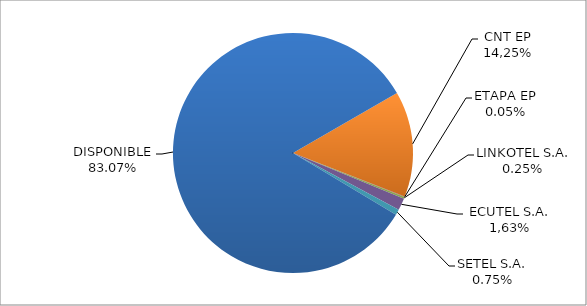
| Category | CODIGO DE AREA 4 |
|---|---|
| CORPORACIÓN NACIONAL TELECOMUNICACIONES CNT EP | 0.142 |
| ETAPA EP | 0.001 |
| LINKOTEL S.A. | 0.002 |
| CONECEL S.A. (ECUADORTELECOM S.A.) | 0.016 |
| SETEL S.A. | 0.008 |
| DISPONIBLE | 0.831 |